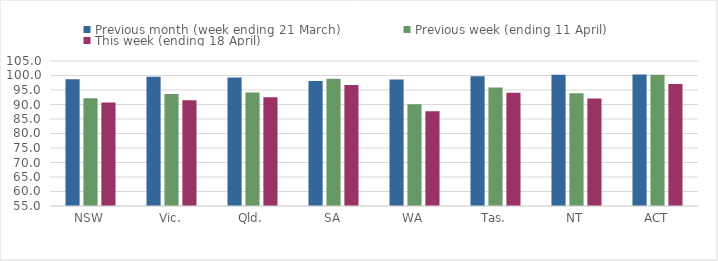
| Category | Previous month (week ending 21 March) | Previous week (ending 11 April) | This week (ending 18 April) |
|---|---|---|---|
| NSW | 98.71 | 92.176 | 90.713 |
| Vic. | 99.527 | 93.618 | 91.426 |
| Qld. | 99.314 | 94.115 | 92.465 |
| SA | 98.102 | 98.855 | 96.754 |
| WA | 98.658 | 90.067 | 87.679 |
| Tas. | 99.722 | 95.896 | 94.025 |
| NT | 100.257 | 93.917 | 92.104 |
| ACT | 100.356 | 100.282 | 97.06 |